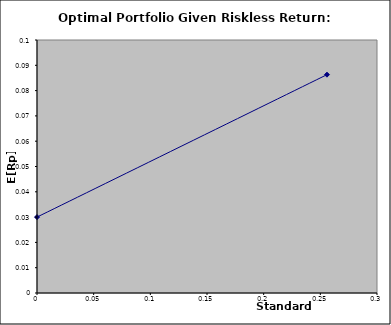
| Category | Series 0 |
|---|---|
| 0.0 | 0.03 |
| 0.25584173010761385 | 0.086 |